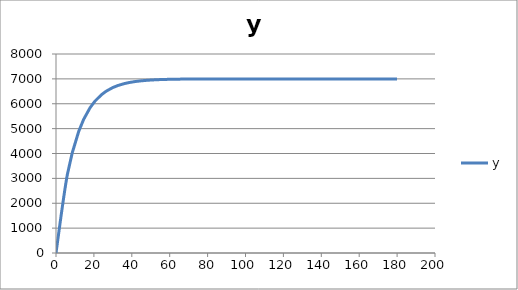
| Category | y |
|---|---|
| 0.0 | 0 |
| 6.0 | 3158.319 |
| 12.0 | 4891.641 |
| 18.0 | 5842.908 |
| 24.0 | 6364.974 |
| 30.0 | 6651.491 |
| 36.0 | 6808.734 |
| 42.0 | 6895.031 |
| 48.0 | 6942.392 |
| 54.0 | 6968.384 |
| 60.0 | 6982.649 |
| 66.0 | 6990.477 |
| 72.0 | 6994.774 |
| 78.0 | 6997.132 |
| 84.0 | 6998.426 |
| 90.0 | 6999.136 |
| 96.0 | 6999.526 |
| 102.0 | 6999.74 |
| 108.0 | 6999.857 |
| 114.0 | 6999.922 |
| 120.0 | 6999.957 |
| 126.0 | 6999.976 |
| 132.0 | 6999.987 |
| 138.0 | 6999.993 |
| 144.0 | 6999.996 |
| 150.0 | 6999.998 |
| 156.0 | 6999.999 |
| 162.0 | 6999.999 |
| 168.0 | 7000 |
| 174.0 | 7000 |
| 180.0 | 7000 |